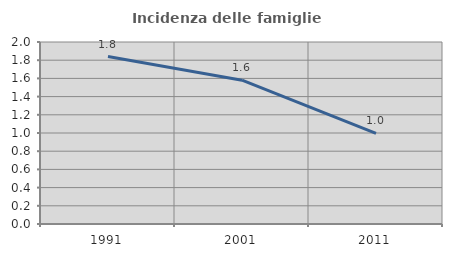
| Category | Incidenza delle famiglie numerose |
|---|---|
| 1991.0 | 1.84 |
| 2001.0 | 1.581 |
| 2011.0 | 0.997 |